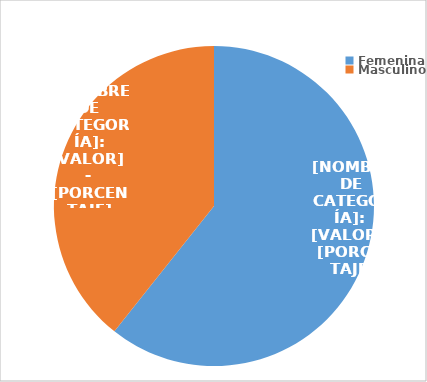
| Category | Series 0 |
|---|---|
| Femenina | 3366 |
| Masculino | 2180 |